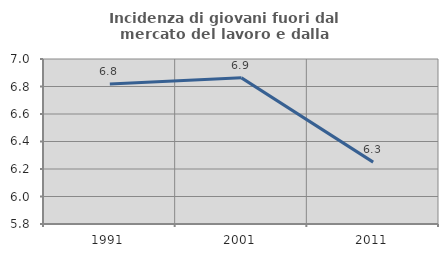
| Category | Incidenza di giovani fuori dal mercato del lavoro e dalla formazione  |
|---|---|
| 1991.0 | 6.818 |
| 2001.0 | 6.863 |
| 2011.0 | 6.25 |